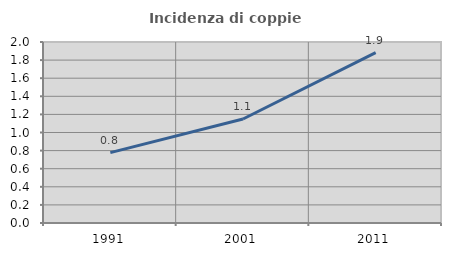
| Category | Incidenza di coppie miste |
|---|---|
| 1991.0 | 0.777 |
| 2001.0 | 1.149 |
| 2011.0 | 1.883 |